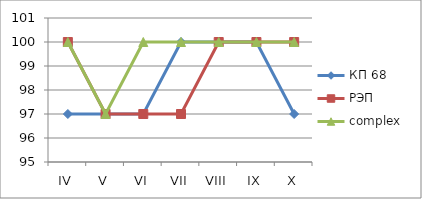
| Category | КП 68 | РЭП  | complex |
|---|---|---|---|
| IV | 97 | 100 | 100 |
| V | 97 | 97 | 97 |
| VI | 97 | 97 | 100 |
| VII | 100 | 97 | 100 |
| VIII | 100 | 100 | 100 |
| IX | 100 | 100 | 100 |
| X | 97 | 100 | 100 |